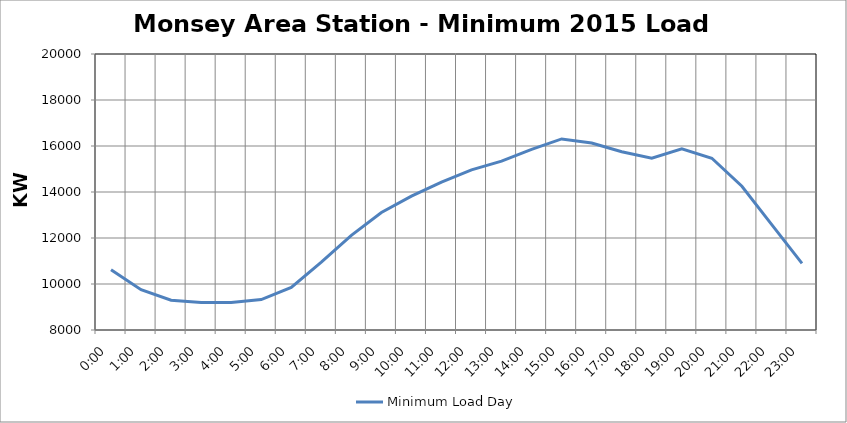
| Category | Minimum Load Day |
|---|---|
| 0.0 | 10617.2 |
| 0.041666666666666664 | 9753.6 |
| 0.08333333333333333 | 9296.4 |
| 0.125 | 9194.8 |
| 0.16666666666666666 | 9194.8 |
| 0.20833333333333334 | 9321.8 |
| 0.25 | 9855.2 |
| 0.2916666666666667 | 10947.4 |
| 0.3333333333333333 | 12115.8 |
| 0.375 | 13106.4 |
| 0.4166666666666667 | 13817.6 |
| 0.4583333333333333 | 14427.2 |
| 0.5 | 14960.6 |
| 0.5416666666666666 | 15341.6 |
| 0.5833333333333334 | 15849.6 |
| 0.625 | 16306.8 |
| 0.6666666666666666 | 16129 |
| 0.7083333333333334 | 15748 |
| 0.75 | 15468.6 |
| 0.7916666666666666 | 15875 |
| 0.8333333333333334 | 15468.6 |
| 0.875 | 14249.4 |
| 0.9166666666666666 | 12573 |
| 0.9583333333333334 | 10896.6 |